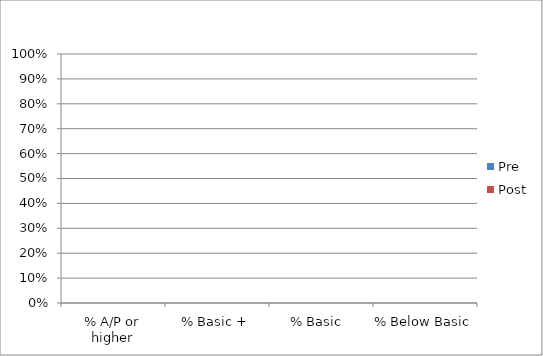
| Category | Pre | Post |
|---|---|---|
| % A/P or higher | 0 | 0 |
| % Basic + | 0 | 0 |
| % Basic  | 0 | 0 |
| % Below Basic | 0 | 0 |